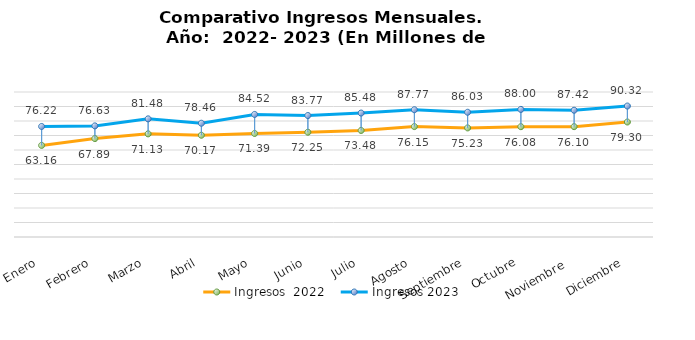
| Category | Ingresos  2022 | Ingresos 2023 |
|---|---|---|
| Enero | 63.161 | 76.222 |
| Febrero | 67.895 | 76.631 |
| Marzo | 71.128 | 81.479 |
| Abril | 70.172 | 78.455 |
| Mayo | 71.389 | 84.524 |
| Junio | 72.252 | 83.766 |
| Julio | 73.48 | 85.478 |
| Agosto | 76.149 | 87.772 |
| Septiembre | 75.231 | 86.029 |
| Octubre | 76.078 | 88.003 |
| Noviembre  | 76.1 | 87.424 |
| Diciembre | 79.301 | 90.318 |